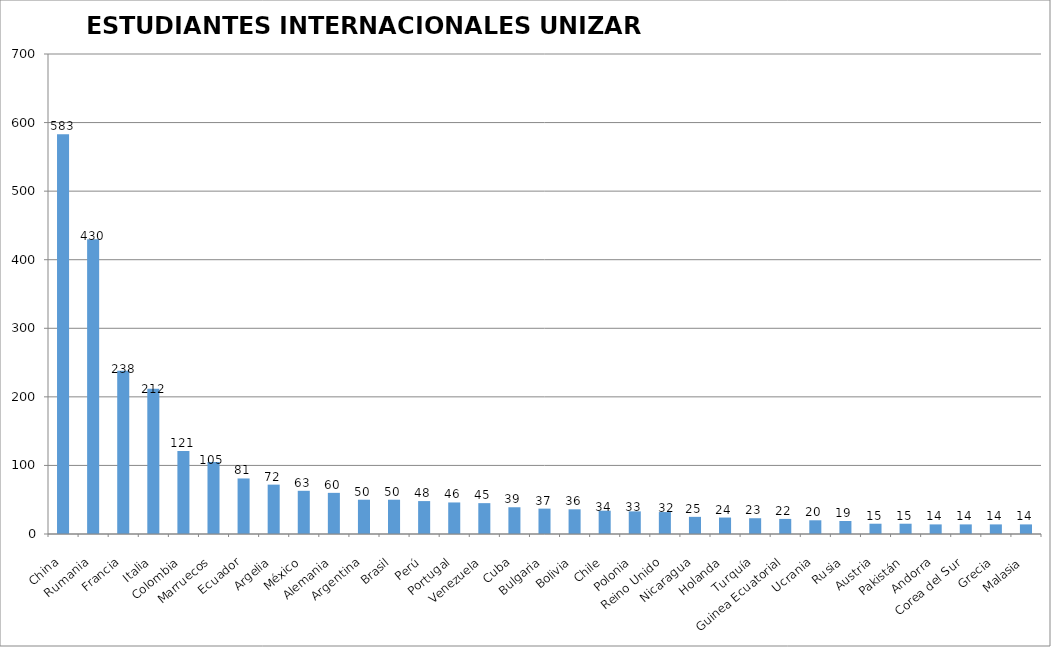
| Category | ESTUDIANTES INTERNACIONALES UNIZAR
2020-21 |
|---|---|
| China | 583 |
| Rumania | 430 |
| Francia | 238 |
| Italia | 212 |
| Colombia | 121 |
| Marruecos | 105 |
| Ecuador | 81 |
| Argelia | 72 |
| México | 63 |
| Alemania | 60 |
| Argentina | 50 |
| Brasil | 50 |
| Perú | 48 |
| Portugal | 46 |
| Venezuela | 45 |
| Cuba | 39 |
| Bulgaria | 37 |
| Bolivia | 36 |
| Chile | 34 |
| Polonia | 33 |
| Reino Unido | 32 |
| Nicaragua | 25 |
| Holanda | 24 |
| Turquía | 23 |
| Guinea Ecuatorial | 22 |
| Ucrania | 20 |
| Rusia | 19 |
| Austria | 15 |
| Pakistán | 15 |
| Andorra | 14 |
| Corea del Sur | 14 |
| Grecia | 14 |
| Malasia | 14 |